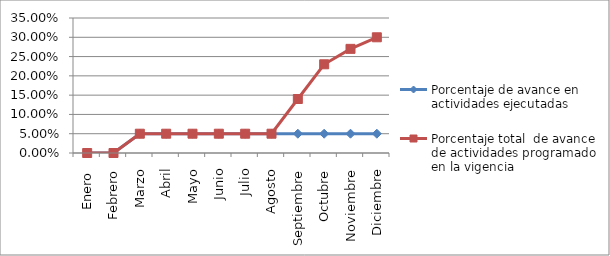
| Category | Porcentaje de avance en actividades ejecutadas | Porcentaje total  de avance de actividades programado en la vigencia |
|---|---|---|
| Enero  | 0 | 0 |
| Febrero | 0 | 0 |
| Marzo | 0.05 | 0.05 |
| Abril | 0.05 | 0.05 |
| Mayo | 0.05 | 0.05 |
| Junio | 0.05 | 0.05 |
| Julio | 0.05 | 0.05 |
| Agosto | 0.05 | 0.05 |
| Septiembre | 0.05 | 0.14 |
| Octubre | 0.05 | 0.23 |
| Noviembre | 0.05 | 0.27 |
| Diciembre | 0.05 | 0.3 |